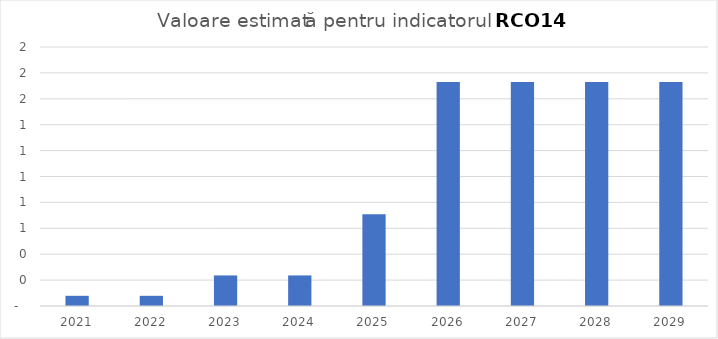
| Category | Series 0 |
|---|---|
| 2021.0 | 0.079 |
| 2022.0 | 0.079 |
| 2023.0 | 0.236 |
| 2024.0 | 0.236 |
| 2025.0 | 0.708 |
| 2026.0 | 1.731 |
| 2027.0 | 1.731 |
| 2028.0 | 1.731 |
| 2029.0 | 1.731 |